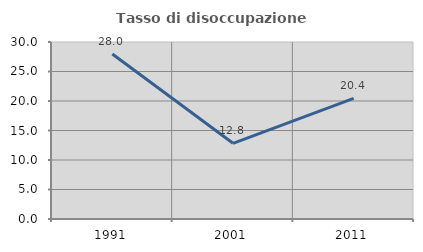
| Category | Tasso di disoccupazione giovanile  |
|---|---|
| 1991.0 | 27.978 |
| 2001.0 | 12.829 |
| 2011.0 | 20.443 |